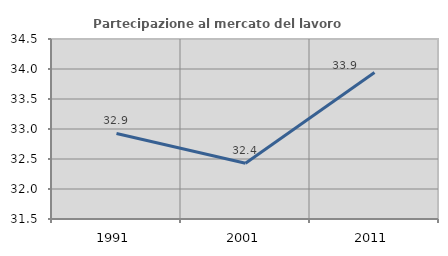
| Category | Partecipazione al mercato del lavoro  femminile |
|---|---|
| 1991.0 | 32.926 |
| 2001.0 | 32.428 |
| 2011.0 | 33.941 |